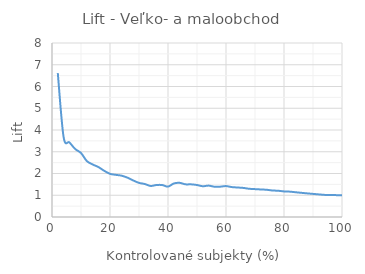
| Category | Veľko- a maloobchod |
|---|---|
| 2.0 | 6.618 |
| 4.0 | 3.676 |
| 6.0 | 3.431 |
| 8.0 | 3.125 |
| 10.0 | 2.941 |
| 12.0 | 2.574 |
| 14.0 | 2.416 |
| 16.0 | 2.298 |
| 18.0 | 2.124 |
| 20.0 | 1.985 |
| 22.0 | 1.939 |
| 24.0 | 1.9 |
| 26.0 | 1.81 |
| 28.0 | 1.681 |
| 30.0 | 1.569 |
| 32.0 | 1.517 |
| 34.0 | 1.427 |
| 36.0 | 1.471 |
| 38.0 | 1.471 |
| 40.0 | 1.397 |
| 42.0 | 1.541 |
| 44.0 | 1.571 |
| 46.0 | 1.503 |
| 48.0 | 1.501 |
| 50.0 | 1.471 |
| 52.0 | 1.414 |
| 54.0 | 1.443 |
| 56.0 | 1.392 |
| 58.0 | 1.395 |
| 60.0 | 1.422 |
| 62.0 | 1.376 |
| 64.0 | 1.356 |
| 66.0 | 1.337 |
| 68.0 | 1.298 |
| 70.0 | 1.282 |
| 72.0 | 1.266 |
| 74.0 | 1.252 |
| 76.0 | 1.219 |
| 78.0 | 1.207 |
| 80.0 | 1.176 |
| 82.0 | 1.166 |
| 84.0 | 1.138 |
| 86.0 | 1.111 |
| 88.0 | 1.086 |
| 90.0 | 1.062 |
| 92.0 | 1.039 |
| 94.0 | 1.017 |
| 96.0 | 1.011 |
| 98.0 | 1.005 |
| 100.0 | 1 |